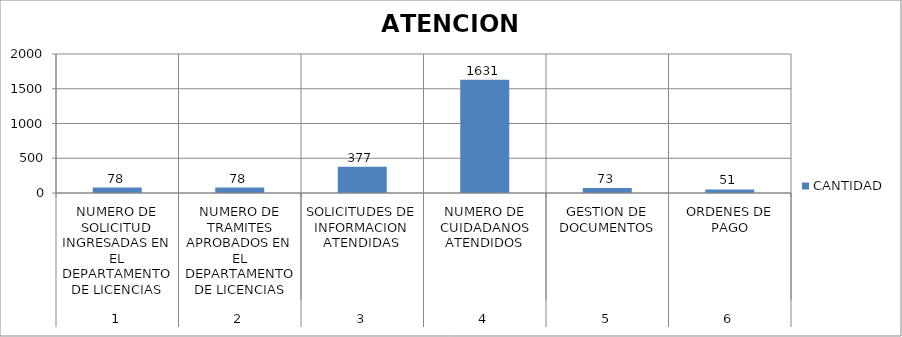
| Category | CANTIDAD |
|---|---|
| 0 | 78 |
| 1 | 78 |
| 2 | 377 |
| 3 | 1631 |
| 4 | 73 |
| 5 | 51 |